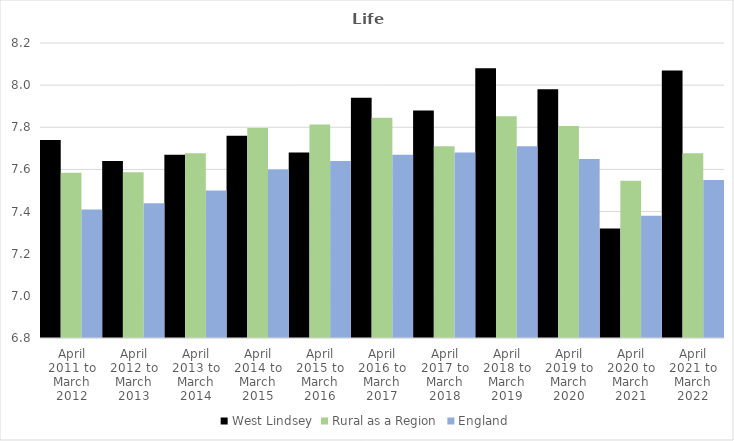
| Category | West Lindsey | Rural as a Region | England |
|---|---|---|---|
| April 2011 to March 2012 | 7.74 | 7.584 | 7.41 |
| April 2012 to March 2013 | 7.64 | 7.586 | 7.44 |
| April 2013 to March 2014 | 7.67 | 7.677 | 7.5 |
| April 2014 to March 2015 | 7.76 | 7.797 | 7.6 |
| April 2015 to March 2016 | 7.68 | 7.813 | 7.64 |
| April 2016 to March 2017 | 7.94 | 7.845 | 7.67 |
| April 2017 to March 2018 | 7.88 | 7.71 | 7.68 |
| April 2018 to March 2019 | 8.08 | 7.852 | 7.71 |
| April 2019 to March 2020 | 7.98 | 7.806 | 7.65 |
| April 2020 to March 2021 | 7.32 | 7.546 | 7.38 |
| April 2021 to March 2022 | 8.07 | 7.677 | 7.55 |